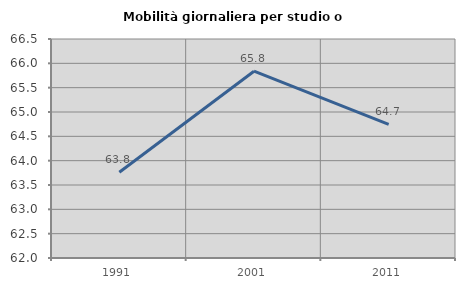
| Category | Mobilità giornaliera per studio o lavoro |
|---|---|
| 1991.0 | 63.762 |
| 2001.0 | 65.838 |
| 2011.0 | 64.745 |